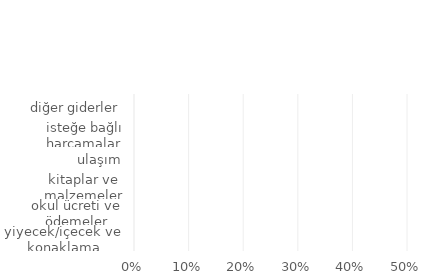
| Category | Series 0 |
|---|---|
| yiyecek/içecek ve konaklama | 0 |
| okul ücreti ve ödemeler | 0 |
| kitaplar ve malzemeler | 0 |
| ulaşım | 0 |
| isteğe bağlı harcamalar | 0 |
| diğer giderler | 0 |